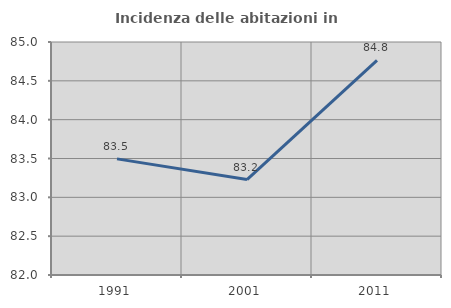
| Category | Incidenza delle abitazioni in proprietà  |
|---|---|
| 1991.0 | 83.495 |
| 2001.0 | 83.228 |
| 2011.0 | 84.764 |